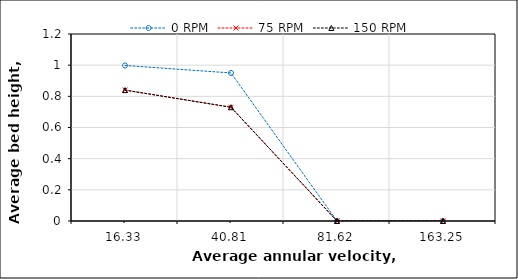
| Category | 0 RPM | 75 RPM | 150 RPM |
|---|---|---|---|
| 16.33 | 0.998 | 0.84 | 0.84 |
| 40.81 | 0.95 | 0.73 | 0.73 |
| 81.62 | 0 | 0 | 0 |
| 163.25 | 0 | 0 | 0 |